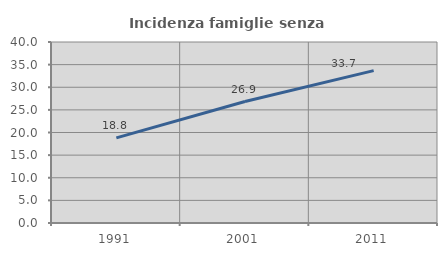
| Category | Incidenza famiglie senza nuclei |
|---|---|
| 1991.0 | 18.824 |
| 2001.0 | 26.85 |
| 2011.0 | 33.669 |